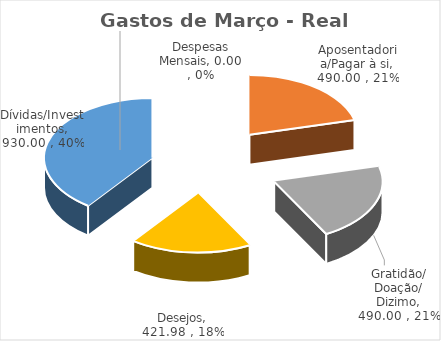
| Category | Gastos de Março - Real Acumulado |
|---|---|
| Despesas Mensais | 0 |
| Aposentadoria/Pagar à si | 490 |
| Gratidão/ Doação/ Dizimo | 490 |
| Desejos | 421.98 |
| Dívidas/Investimentos | 930 |